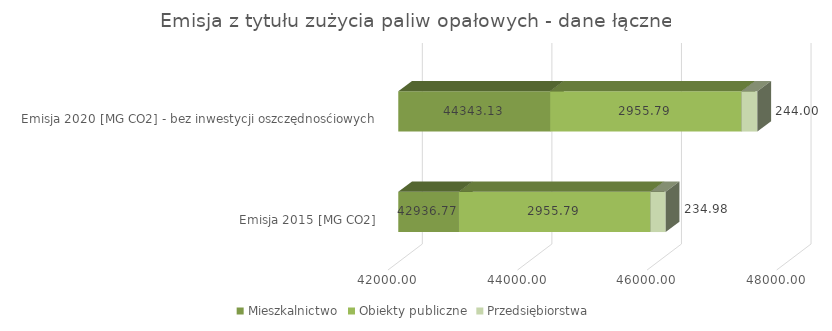
| Category | Mieszkalnictwo | Obiekty publiczne | Przedsiębiorstwa |
|---|---|---|---|
| Emisja 2015 [MG CO2] | 42936.774 | 2955.793 | 234.983 |
| Emisja 2020 [MG CO2] - bez inwestycji oszczędnosćiowych | 44343.133 | 2955.793 | 243.998 |